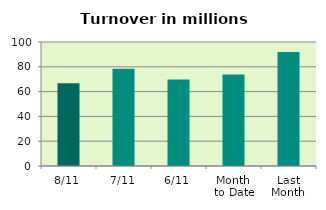
| Category | Series 0 |
|---|---|
| 8/11 | 66.682 |
| 7/11 | 78.398 |
| 6/11 | 69.847 |
| Month 
to Date | 73.816 |
| Last
Month | 91.964 |